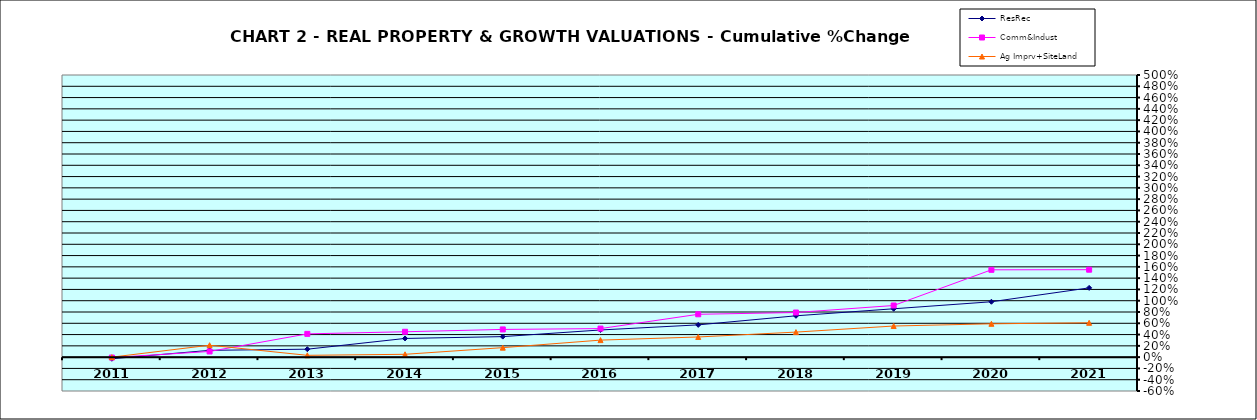
| Category | ResRec | Comm&Indust | Ag Imprv+SiteLand |
|---|---|---|---|
| 2011.0 | -0.028 | -0.007 | 0 |
| 2012.0 | 0.121 | 0.101 | 0.211 |
| 2013.0 | 0.141 | 0.413 | 0.032 |
| 2014.0 | 0.331 | 0.45 | 0.05 |
| 2015.0 | 0.364 | 0.491 | 0.168 |
| 2016.0 | 0.482 | 0.506 | 0.302 |
| 2017.0 | 0.572 | 0.76 | 0.357 |
| 2018.0 | 0.733 | 0.791 | 0.444 |
| 2019.0 | 0.857 | 0.915 | 0.551 |
| 2020.0 | 0.981 | 1.547 | 0.591 |
| 2021.0 | 1.227 | 1.55 | 0.608 |